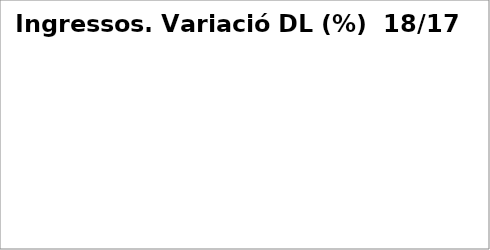
| Category | Series 0 |
|---|---|
| Impostos directes | -0.052 |
| Impostos indirectes | 0.093 |
| Taxes, preus públics i altres ingressos | 0.032 |
| Transferències corrents | 0 |
| Ingressos patrimonials | -0.18 |
| Venda d'inversions reals | -0.693 |
| Transferències de capital | 0.785 |
| Actius financers* | 0 |
| Passius financers | 0.496 |